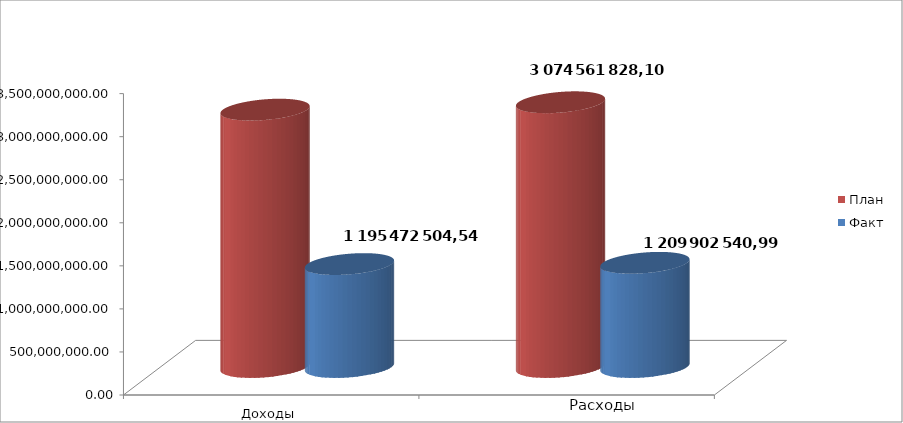
| Category | План | Факт |
|---|---|---|
| 0 | 2988679286.12 | 1195492504.54 |
| 1 | 3074561828.1 | 1209902540.99 |